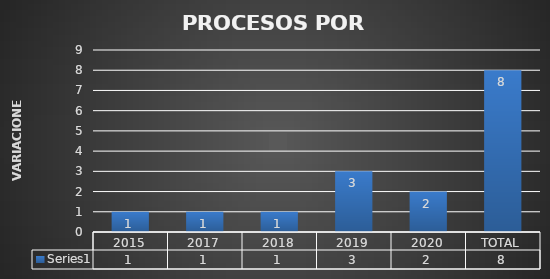
| Category | Series 0 |
|---|---|
| 2015 | 1 |
| 2017 | 1 |
| 2018 | 1 |
| 2019 | 3 |
| 2020 | 2 |
| TOTAL | 8 |